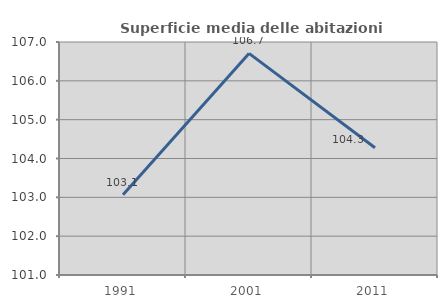
| Category | Superficie media delle abitazioni occupate |
|---|---|
| 1991.0 | 103.064 |
| 2001.0 | 106.707 |
| 2011.0 | 104.278 |